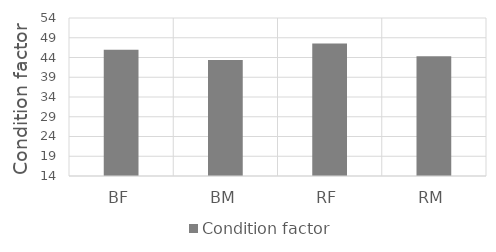
| Category | Condition factor |
|---|---|
| BF | 45.941 |
| BM | 43.374 |
| RF | 47.533 |
| RM | 44.297 |